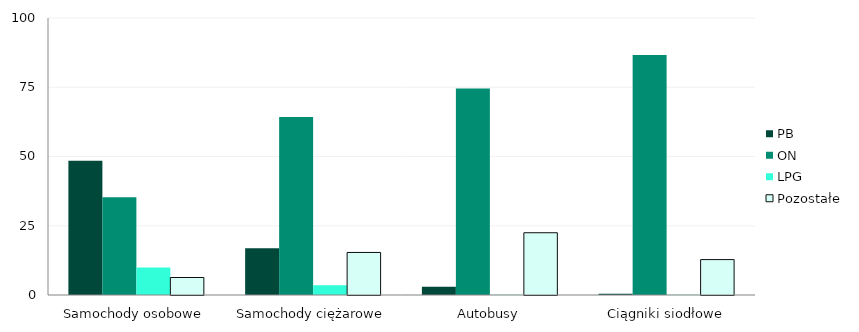
| Category | PB | ON | LPG | Pozostałe |
|---|---|---|---|---|
| 0 | 48.48 | 35.244 | 9.962 | 6.314 |
| 1 | 16.867 | 64.26 | 3.516 | 15.357 |
| 2 | 2.937 | 74.508 | 0.081 | 22.474 |
| 3 | 0.451 | 86.638 | 0.128 | 12.783 |